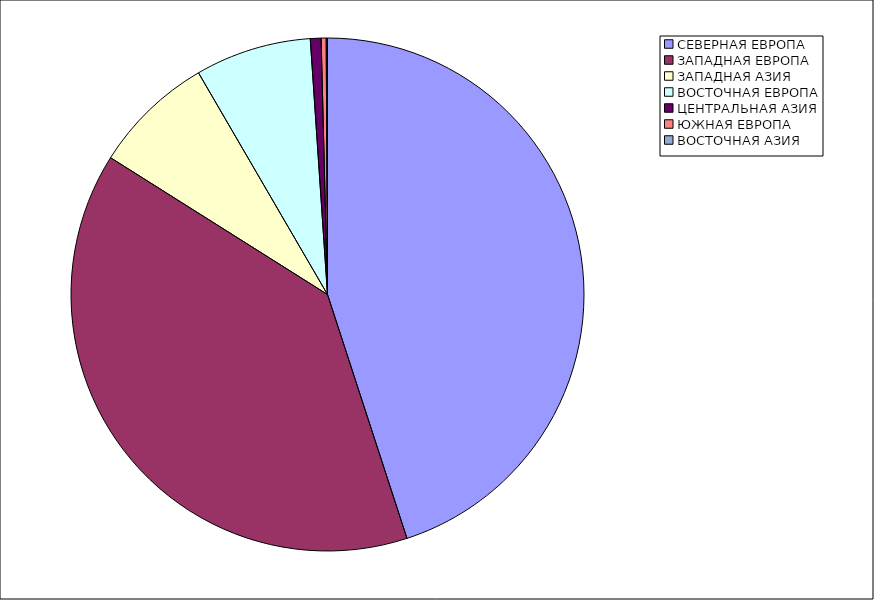
| Category | Оборот |
|---|---|
| СЕВЕРНАЯ ЕВРОПА | 44.985 |
| ЗАПАДНАЯ ЕВРОПА | 38.968 |
| ЗАПАДНАЯ АЗИЯ | 7.658 |
| ВОСТОЧНАЯ ЕВРОПА | 7.317 |
| ЦЕНТРАЛЬНАЯ АЗИЯ | 0.675 |
| ЮЖНАЯ ЕВРОПА | 0.317 |
| ВОСТОЧНАЯ АЗИЯ | 0.08 |